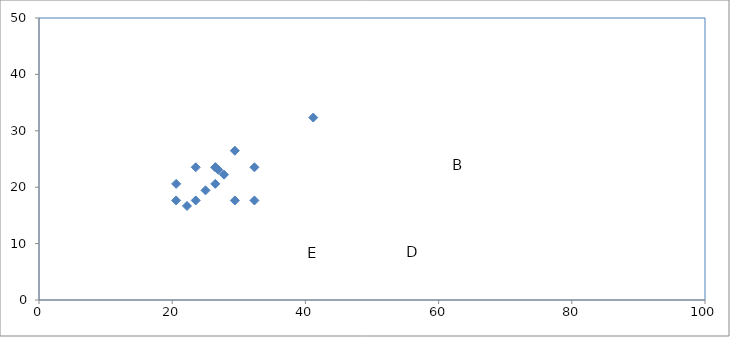
| Category | Series 0 |
|---|---|
| 20.59 | 17.65 |
| 26.47 | 23.53 |
| 23.53 | 23.53 |
| 26.92 | 23.08 |
| 32.35 | 17.65 |
| 29.41 | 17.65 |
| 26.47 | 20.59 |
| 20.59 | 20.59 |
| 23.53 | 17.65 |
| 22.22 | 16.67 |
| 26.47 | 23.53 |
| 32.35 | 23.53 |
| 29.41 | 26.47 |
| 25.0 | 19.44 |
| 41.18 | 32.35 |
| 27.78 | 22.22 |